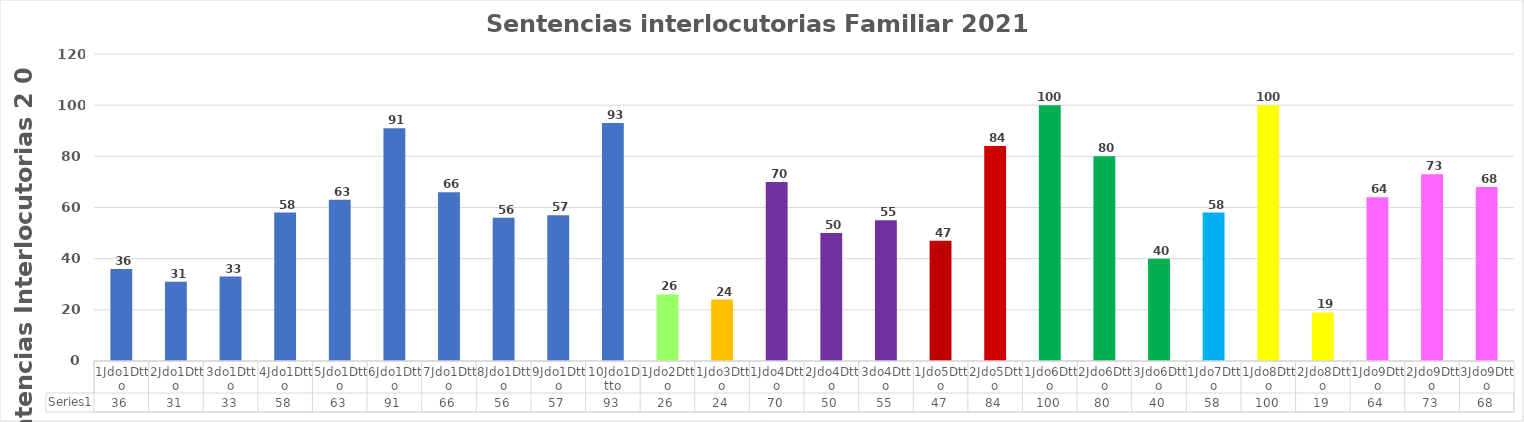
| Category | Series 0 |
|---|---|
| 1Jdo1Dtto | 36 |
| 2Jdo1Dtto | 31 |
| 3do1Dtto | 33 |
| 4Jdo1Dtto | 58 |
| 5Jdo1Dtto | 63 |
| 6Jdo1Dtto | 91 |
| 7Jdo1Dtto | 66 |
| 8Jdo1Dtto | 56 |
| 9Jdo1Dtto | 57 |
| 10Jdo1Dtto | 93 |
| 1Jdo2Dtto | 26 |
| 1Jdo3Dtto | 24 |
| 1Jdo4Dtto | 70 |
| 2Jdo4Dtto | 50 |
| 3do4Dtto | 55 |
| 1Jdo5Dtto | 47 |
| 2Jdo5Dtto | 84 |
| 1Jdo6Dtto | 100 |
| 2Jdo6Dtto | 80 |
| 3Jdo6Dtto | 40 |
| 1Jdo7Dtto | 58 |
| 1Jdo8Dtto | 100 |
| 2Jdo8Dtto | 19 |
| 1Jdo9Dtto | 64 |
| 2Jdo9Dtto | 73 |
| 3Jdo9Dtto | 68 |